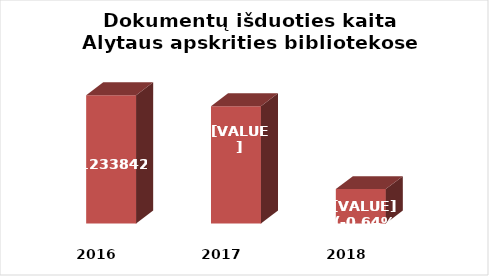
| Category | Series 0 |
|---|---|
| 2016.0 | 1233842 |
| 2017.0 | 1225840 |
| 2018.0 | 1165168 |